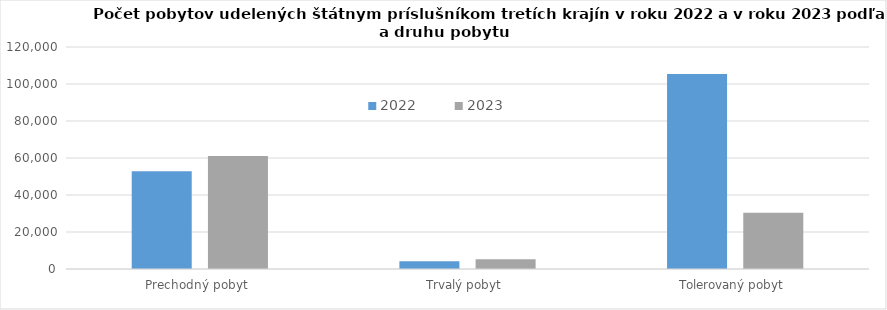
| Category | 2022 | 2023 |
|---|---|---|
| Prechodný pobyt  | 52892 | 61110 |
| Trvalý pobyt  | 4144 | 5254 |
| Tolerovaný pobyt  | 105387 | 30451 |